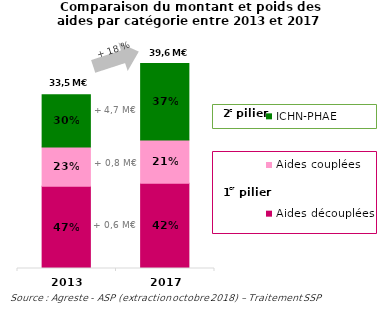
| Category | Aides découplées | Aides couplées   | ICHN-PHAE |
|---|---|---|---|
| 2013.0 | 15.904 | 7.574 | 10.063 |
| 2017.0 | 16.488 | 8.329 | 14.772 |